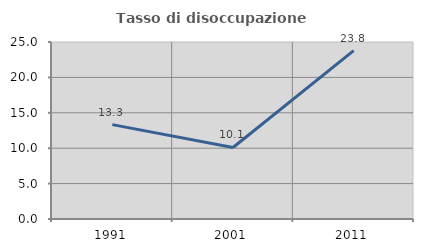
| Category | Tasso di disoccupazione giovanile  |
|---|---|
| 1991.0 | 13.333 |
| 2001.0 | 10.104 |
| 2011.0 | 23.78 |